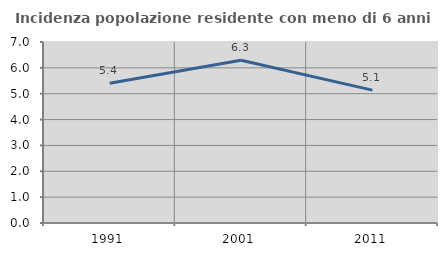
| Category | Incidenza popolazione residente con meno di 6 anni |
|---|---|
| 1991.0 | 5.408 |
| 2001.0 | 6.294 |
| 2011.0 | 5.139 |